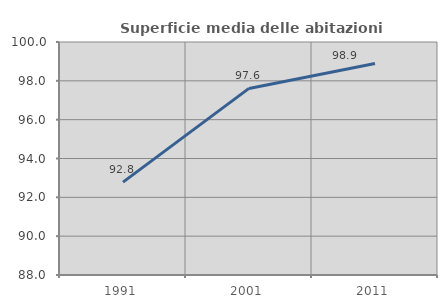
| Category | Superficie media delle abitazioni occupate |
|---|---|
| 1991.0 | 92.784 |
| 2001.0 | 97.609 |
| 2011.0 | 98.895 |